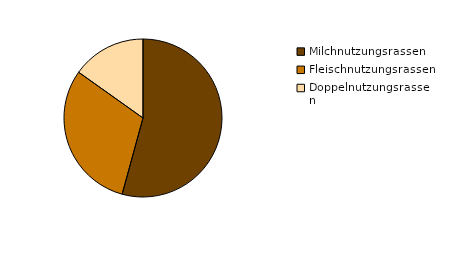
| Category | Series 0 |
|---|---|
| Milchnutzungsrassen | 243206 |
| Fleischnutzungsrassen | 137113 |
| Doppelnutzungsrassen | 67990 |